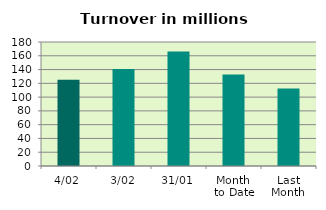
| Category | Series 0 |
|---|---|
| 4/02 | 125.184 |
| 3/02 | 140.794 |
| 31/01 | 166.16 |
| Month 
to Date | 132.989 |
| Last
Month | 112.571 |